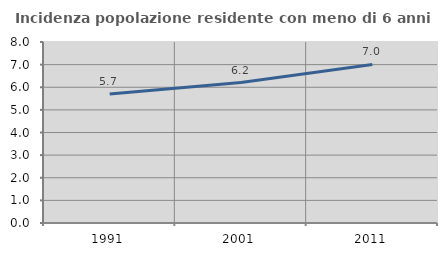
| Category | Incidenza popolazione residente con meno di 6 anni |
|---|---|
| 1991.0 | 5.701 |
| 2001.0 | 6.207 |
| 2011.0 | 7.007 |